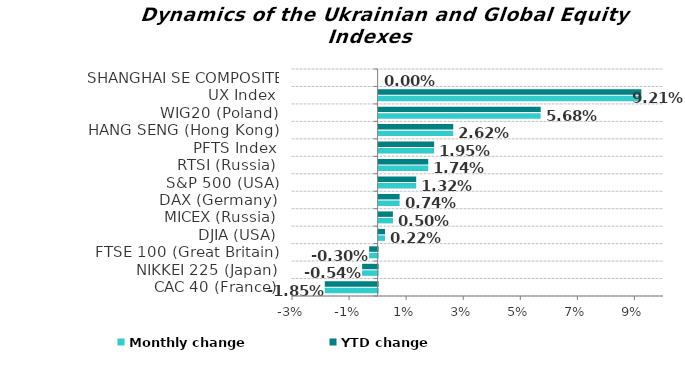
| Category | Monthly change | YTD change |
|---|---|---|
| CAC 40 (France) | -0.019 | -0.019 |
| NIKKEI 225 (Japan) | -0.005 | -0.005 |
| FTSE 100 (Great Britain) | -0.003 | -0.003 |
| DJIA (USA) | 0.002 | 0.002 |
| MICEX (Russia) | 0.005 | 0.005 |
| DAX (Germany) | 0.007 | 0.007 |
| S&P 500 (USA) | 0.013 | 0.013 |
| RTSI (Russia) | 0.017 | 0.017 |
| PFTS Index | 0.019 | 0.019 |
| HANG SENG (Hong Kong) | 0.026 | 0.026 |
| WIG20 (Poland) | 0.057 | 0.057 |
| UX Index | 0.092 | 0.092 |
| SHANGHAI SE COMPOSITE (China) | 0 | 0 |